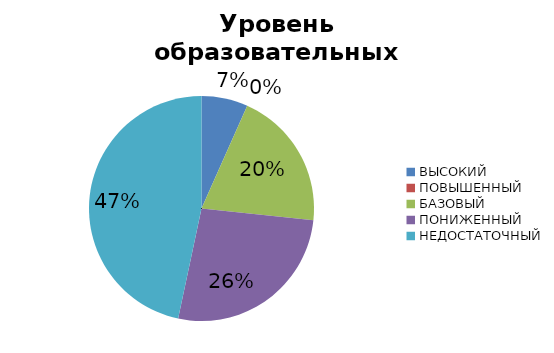
| Category | Series 0 |
|---|---|
| ВЫСОКИЙ | 5.556 |
| ПОВЫШЕННЫЙ | 0 |
| БАЗОВЫЙ | 16.667 |
| ПОНИЖЕННЫЙ | 22.222 |
| НЕДОСТАТОЧНЫЙ | 38.889 |